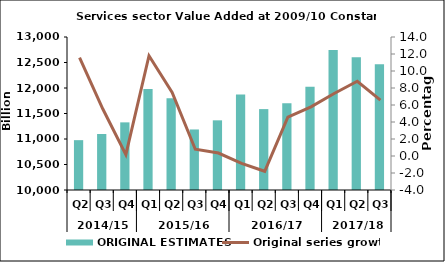
| Category | ORIGINAL ESTIMATES |
|---|---|
| 0 | 10977.343 |
| 1 | 11098.496 |
| 2 | 11326.244 |
| 3 | 11978.334 |
| 4 | 11797.979 |
| 5 | 11186.957 |
| 6 | 11366.045 |
| 7 | 11873.876 |
| 8 | 11586.159 |
| 9 | 11698.708 |
| 10 | 12023.272 |
| 11 | 12747.341 |
| 12 | 12604.939 |
| 13 | 12466.952 |